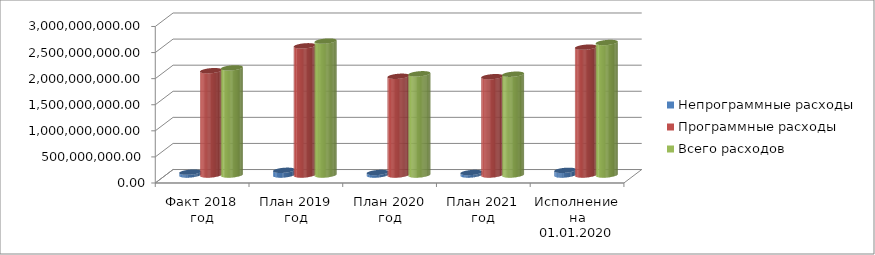
| Category | Непрограммные расходы | Программные расходы | Всего расходов |
|---|---|---|---|
| Факт 2018 год | 54110787.01 | 1999126115.26 | 2053236902.27 |
| План 2019 год | 90194542.92 | 2476021978.06 | 2566216520.98 |
| План 2020 год | 47619740 | 1892292986.57 | 1939912726.57 |
| План 2021 год | 47624840 | 1884242155.94 | 1931866995.94 |
| Исполнение на 01.01.2020 года | 89627825.55 | 2450117898.01 | 2539745723.56 |